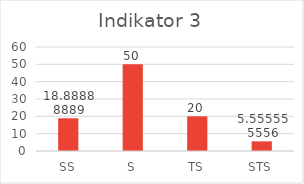
| Category | Series 0 |
|---|---|
| 0 | 18.889 |
| 1 | 50 |
| 2 | 20 |
| 3 | 5.556 |